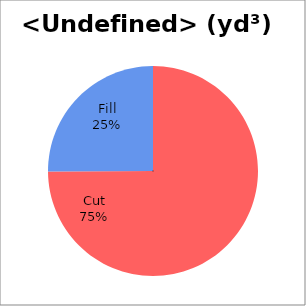
| Category | Series 0 |
|---|---|
| Cut | 16470.586 |
| Fill | 5516.798 |